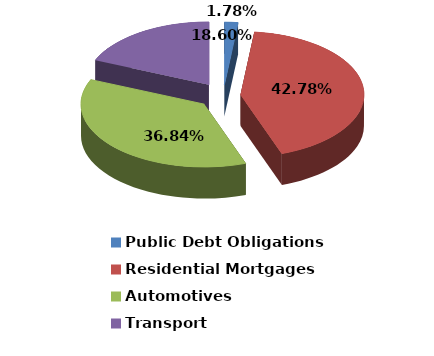
| Category | Series 0 |
|---|---|
| Public Debt Obligations | 0.018 |
| Residential Mortgages | 0.428 |
| Automotives | 0.368 |
| Transport | 0.186 |